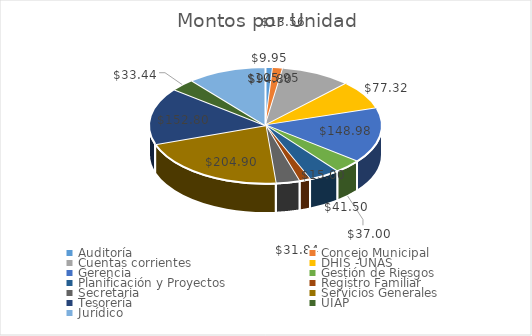
| Category | Series 0 | Series 1 |
|---|---|---|
| Auditoría | 9.95 | 0.01 |
| Concejo Municipal | 13.56 | 0.014 |
| Cuentas corrientes | 94.8 | 0.098 |
| DHIS -UNAS | 77.32 | 0.08 |
| Gerencia | 148.98 | 0.154 |
| Gestión de Riesgos | 37 | 0.038 |
| Planificación y Proyectos | 41.5 | 0.043 |
| Registro Familiar | 15 | 0.016 |
| Secretaria  | 31.84 | 0.033 |
| Servicios Generales | 204.9 | 0.212 |
| Tesorería | 152.8 | 0.158 |
| UIAP | 33.44 | 0.035 |
| Jurídico  | 105.95 | 0.11 |